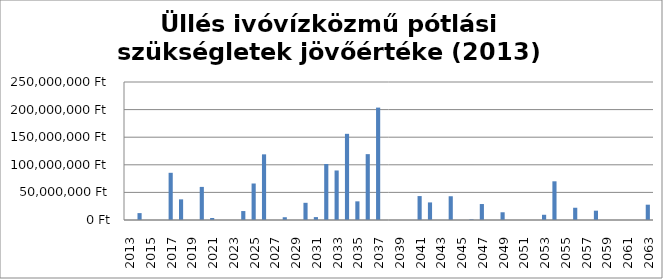
| Category | Series 0 |
|---|---|
| 2013.0 | 0 |
| 2014.0 | 12495105 |
| 2015.0 | 0 |
| 2016.0 | 0 |
| 2017.0 | 85506002.662 |
| 2018.0 | 37392497.218 |
| 2019.0 | 0 |
| 2020.0 | 59956549.009 |
| 2021.0 | 3573964.719 |
| 2022.0 | 0 |
| 2023.0 | 0 |
| 2024.0 | 16215898.488 |
| 2025.0 | 66123429.924 |
| 2026.0 | 118935434.003 |
| 2027.0 | 0 |
| 2028.0 | 5028927.266 |
| 2029.0 | 0 |
| 2030.0 | 31137068.847 |
| 2031.0 | 5270496.122 |
| 2032.0 | 101441888.643 |
| 2033.0 | 89713302.006 |
| 2034.0 | 156114478.312 |
| 2035.0 | 33795537.097 |
| 2036.0 | 119305661.489 |
| 2037.0 | 203623135.146 |
| 2038.0 | 0 |
| 2039.0 | 0 |
| 2040.0 | 0 |
| 2041.0 | 43348788.013 |
| 2042.0 | 31854773.373 |
| 2043.0 | 0 |
| 2044.0 | 43025606.246 |
| 2045.0 | 0 |
| 2046.0 | 1140726.988 |
| 2047.0 | 28935440.614 |
| 2048.0 | 0 |
| 2049.0 | 14010403.233 |
| 2050.0 | 0 |
| 2051.0 | 0 |
| 2052.0 | 0 |
| 2053.0 | 9472304.812 |
| 2054.0 | 70084178.827 |
| 2055.0 | 0 |
| 2056.0 | 22191543.058 |
| 2057.0 | 0 |
| 2058.0 | 16900799.66 |
| 2059.0 | 0 |
| 2060.0 | 0 |
| 2061.0 | 0 |
| 2062.0 | 0 |
| 2063.0 | 27739640.082 |